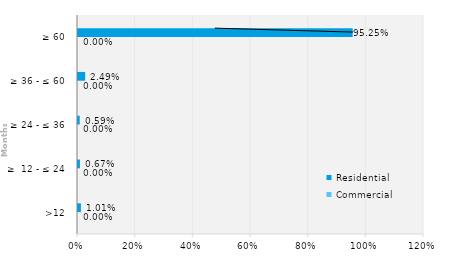
| Category | Commercial | Residential |
|---|---|---|
| >12 | 0 | 0.01 |
| ≥  12 - ≤ 24 | 0 | 0.007 |
| ≥ 24 - ≤ 36 | 0 | 0.006 |
| ≥ 36 - ≤ 60 | 0 | 0.025 |
| ≥ 60 | 0 | 0.953 |